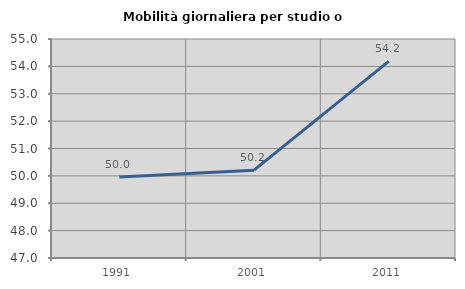
| Category | Mobilità giornaliera per studio o lavoro |
|---|---|
| 1991.0 | 49.961 |
| 2001.0 | 50.209 |
| 2011.0 | 54.183 |